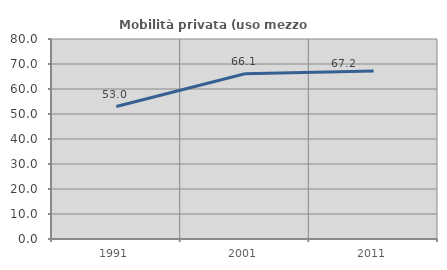
| Category | Mobilità privata (uso mezzo privato) |
|---|---|
| 1991.0 | 52.989 |
| 2001.0 | 66.083 |
| 2011.0 | 67.21 |